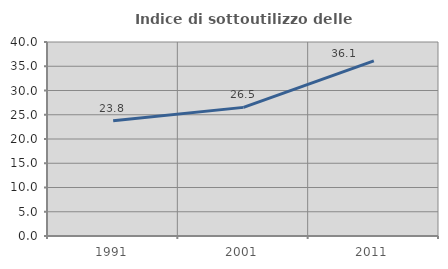
| Category | Indice di sottoutilizzo delle abitazioni  |
|---|---|
| 1991.0 | 23.783 |
| 2001.0 | 26.52 |
| 2011.0 | 36.094 |